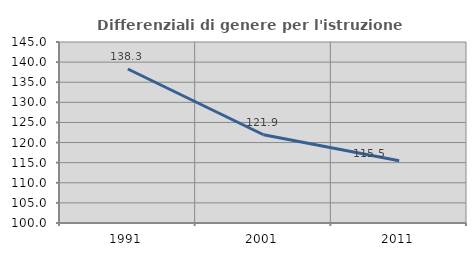
| Category | Differenziali di genere per l'istruzione superiore |
|---|---|
| 1991.0 | 138.284 |
| 2001.0 | 121.945 |
| 2011.0 | 115.49 |